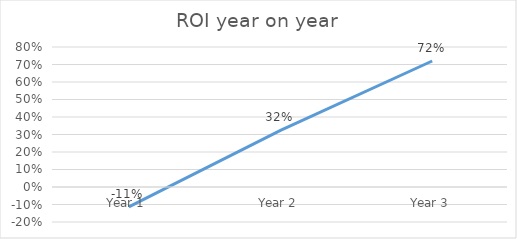
| Category | Year |
|---|---|
| Year 1 | -0.113 |
| Year 2 | 0.324 |
| Year 3 | 0.72 |